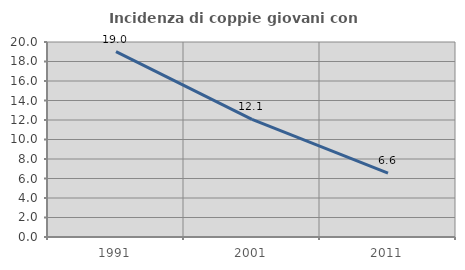
| Category | Incidenza di coppie giovani con figli |
|---|---|
| 1991.0 | 19.011 |
| 2001.0 | 12.062 |
| 2011.0 | 6.557 |